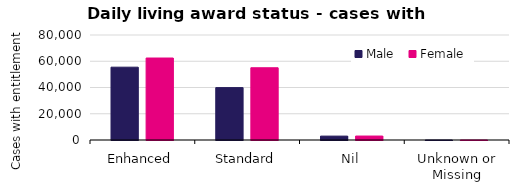
| Category | Male  | Female |
|---|---|---|
| Enhanced | 55478 | 62456 |
| Standard | 39905 | 55040 |
| Nil | 2957 | 3011 |
| Unknown or Missing | 6 | 7 |